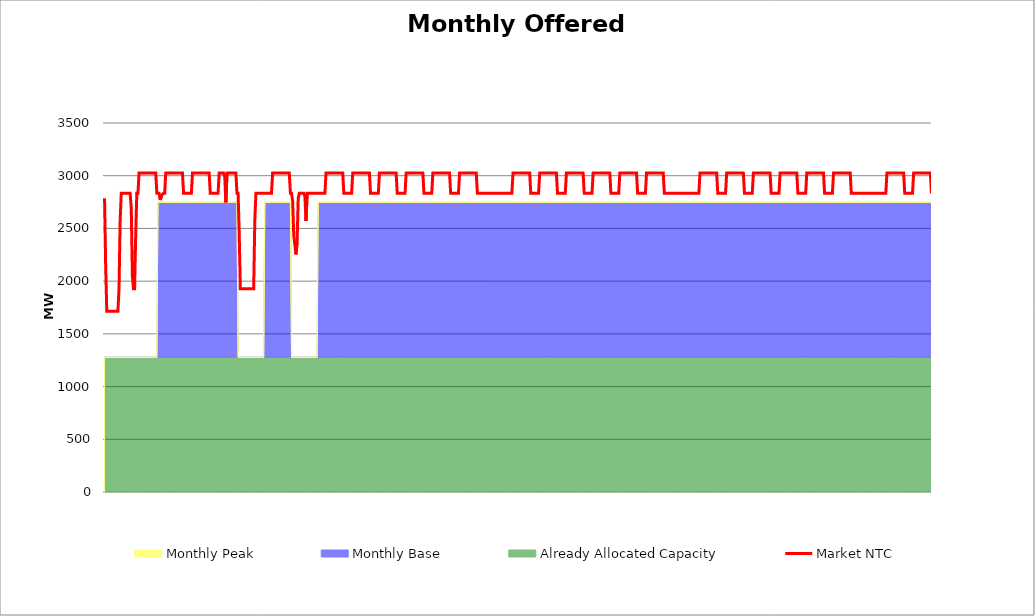
| Category | Market NTC |
|---|---|
| 0 | 2786 |
| 1 | 2143 |
| 2 | 1715 |
| 3 | 1715 |
| 4 | 1715 |
| 5 | 1715 |
| 6 | 1715 |
| 7 | 1715 |
| 8 | 1715 |
| 9 | 1715 |
| 10 | 1715 |
| 11 | 1715 |
| 12 | 1715 |
| 13 | 1929 |
| 14 | 2572 |
| 15 | 2833 |
| 16 | 2833 |
| 17 | 2833 |
| 18 | 2833 |
| 19 | 2833 |
| 20 | 2833 |
| 21 | 2833 |
| 22 | 2833 |
| 23 | 2833 |
| 24 | 2690 |
| 25 | 2047 |
| 26 | 1929 |
| 27 | 1929 |
| 28 | 2452 |
| 29 | 2833 |
| 30 | 2833 |
| 31 | 3025 |
| 32 | 3025 |
| 33 | 3025 |
| 34 | 3025 |
| 35 | 3025 |
| 36 | 3025 |
| 37 | 3025 |
| 38 | 3025 |
| 39 | 3025 |
| 40 | 3025 |
| 41 | 3025 |
| 42 | 3025 |
| 43 | 3025 |
| 44 | 3025 |
| 45 | 3025 |
| 46 | 3025 |
| 47 | 2833 |
| 48 | 2833 |
| 49 | 2833 |
| 50 | 2770 |
| 51 | 2801 |
| 52 | 2825 |
| 53 | 2833 |
| 54 | 2833 |
| 55 | 3025 |
| 56 | 3025 |
| 57 | 3025 |
| 58 | 3025 |
| 59 | 3025 |
| 60 | 3025 |
| 61 | 3025 |
| 62 | 3025 |
| 63 | 3025 |
| 64 | 3025 |
| 65 | 3025 |
| 66 | 3025 |
| 67 | 3025 |
| 68 | 3025 |
| 69 | 3025 |
| 70 | 3025 |
| 71 | 2833 |
| 72 | 2833 |
| 73 | 2833 |
| 74 | 2833 |
| 75 | 2833 |
| 76 | 2833 |
| 77 | 2833 |
| 78 | 2833 |
| 79 | 3025 |
| 80 | 3025 |
| 81 | 3025 |
| 82 | 3025 |
| 83 | 3025 |
| 84 | 3025 |
| 85 | 3025 |
| 86 | 3025 |
| 87 | 3025 |
| 88 | 3025 |
| 89 | 3025 |
| 90 | 3025 |
| 91 | 3025 |
| 92 | 3025 |
| 93 | 3025 |
| 94 | 3025 |
| 95 | 2833 |
| 96 | 2833 |
| 97 | 2833 |
| 98 | 2833 |
| 99 | 2833 |
| 100 | 2833 |
| 101 | 2833 |
| 102 | 2833 |
| 103 | 3025 |
| 104 | 3025 |
| 105 | 3025 |
| 106 | 3025 |
| 107 | 3025 |
| 108 | 2990 |
| 109 | 2747 |
| 110 | 3025 |
| 111 | 3025 |
| 112 | 3025 |
| 113 | 3025 |
| 114 | 3025 |
| 115 | 3025 |
| 116 | 3025 |
| 117 | 3025 |
| 118 | 3025 |
| 119 | 2833 |
| 120 | 2833 |
| 121 | 2452 |
| 122 | 1929 |
| 123 | 1929 |
| 124 | 1929 |
| 125 | 1929 |
| 126 | 1929 |
| 127 | 1929 |
| 128 | 1929 |
| 129 | 1929 |
| 130 | 1929 |
| 131 | 1929 |
| 132 | 1929 |
| 133 | 1929 |
| 134 | 1929 |
| 135 | 2572 |
| 136 | 2833 |
| 137 | 2833 |
| 138 | 2833 |
| 139 | 2833 |
| 140 | 2833 |
| 141 | 2833 |
| 142 | 2833 |
| 143 | 2833 |
| 144 | 2833 |
| 145 | 2833 |
| 146 | 2833 |
| 147 | 2833 |
| 148 | 2833 |
| 149 | 2833 |
| 150 | 2833 |
| 151 | 3025 |
| 152 | 3025 |
| 153 | 3025 |
| 154 | 3025 |
| 155 | 3025 |
| 156 | 3025 |
| 157 | 3025 |
| 158 | 3025 |
| 159 | 3025 |
| 160 | 3025 |
| 161 | 3025 |
| 162 | 3025 |
| 163 | 3025 |
| 164 | 3025 |
| 165 | 3025 |
| 166 | 3025 |
| 167 | 2833 |
| 168 | 2833 |
| 169 | 2760 |
| 170 | 2436 |
| 171 | 2343 |
| 172 | 2254 |
| 173 | 2367 |
| 174 | 2785 |
| 175 | 2833 |
| 176 | 2833 |
| 177 | 2833 |
| 178 | 2833 |
| 179 | 2833 |
| 180 | 2808 |
| 181 | 2570 |
| 182 | 2833 |
| 183 | 2833 |
| 184 | 2833 |
| 185 | 2833 |
| 186 | 2833 |
| 187 | 2833 |
| 188 | 2833 |
| 189 | 2833 |
| 190 | 2833 |
| 191 | 2833 |
| 192 | 2833 |
| 193 | 2833 |
| 194 | 2833 |
| 195 | 2833 |
| 196 | 2833 |
| 197 | 2833 |
| 198 | 2833 |
| 199 | 3025 |
| 200 | 3025 |
| 201 | 3025 |
| 202 | 3025 |
| 203 | 3025 |
| 204 | 3025 |
| 205 | 3025 |
| 206 | 3025 |
| 207 | 3025 |
| 208 | 3025 |
| 209 | 3025 |
| 210 | 3025 |
| 211 | 3025 |
| 212 | 3025 |
| 213 | 3025 |
| 214 | 3025 |
| 215 | 2833 |
| 216 | 2833 |
| 217 | 2833 |
| 218 | 2833 |
| 219 | 2833 |
| 220 | 2833 |
| 221 | 2833 |
| 222 | 2833 |
| 223 | 3025 |
| 224 | 3025 |
| 225 | 3025 |
| 226 | 3025 |
| 227 | 3025 |
| 228 | 3025 |
| 229 | 3025 |
| 230 | 3025 |
| 231 | 3025 |
| 232 | 3025 |
| 233 | 3025 |
| 234 | 3025 |
| 235 | 3025 |
| 236 | 3025 |
| 237 | 3025 |
| 238 | 3025 |
| 239 | 2833 |
| 240 | 2833 |
| 241 | 2833 |
| 242 | 2833 |
| 243 | 2833 |
| 244 | 2833 |
| 245 | 2833 |
| 246 | 2833 |
| 247 | 3025 |
| 248 | 3025 |
| 249 | 3025 |
| 250 | 3025 |
| 251 | 3025 |
| 252 | 3025 |
| 253 | 3025 |
| 254 | 3025 |
| 255 | 3025 |
| 256 | 3025 |
| 257 | 3025 |
| 258 | 3025 |
| 259 | 3025 |
| 260 | 3025 |
| 261 | 3025 |
| 262 | 3025 |
| 263 | 2833 |
| 264 | 2833 |
| 265 | 2833 |
| 266 | 2833 |
| 267 | 2833 |
| 268 | 2833 |
| 269 | 2833 |
| 270 | 2833 |
| 271 | 3025 |
| 272 | 3025 |
| 273 | 3025 |
| 274 | 3025 |
| 275 | 3025 |
| 276 | 3025 |
| 277 | 3025 |
| 278 | 3025 |
| 279 | 3025 |
| 280 | 3025 |
| 281 | 3025 |
| 282 | 3025 |
| 283 | 3025 |
| 284 | 3025 |
| 285 | 3025 |
| 286 | 3025 |
| 287 | 2833 |
| 288 | 2833 |
| 289 | 2833 |
| 290 | 2833 |
| 291 | 2833 |
| 292 | 2833 |
| 293 | 2833 |
| 294 | 2833 |
| 295 | 3025 |
| 296 | 3025 |
| 297 | 3025 |
| 298 | 3025 |
| 299 | 3025 |
| 300 | 3025 |
| 301 | 3025 |
| 302 | 3025 |
| 303 | 3025 |
| 304 | 3025 |
| 305 | 3025 |
| 306 | 3025 |
| 307 | 3025 |
| 308 | 3025 |
| 309 | 3025 |
| 310 | 3025 |
| 311 | 2833 |
| 312 | 2833 |
| 313 | 2833 |
| 314 | 2833 |
| 315 | 2833 |
| 316 | 2833 |
| 317 | 2833 |
| 318 | 2833 |
| 319 | 3025 |
| 320 | 3025 |
| 321 | 3025 |
| 322 | 3025 |
| 323 | 3025 |
| 324 | 3025 |
| 325 | 3025 |
| 326 | 3025 |
| 327 | 3025 |
| 328 | 3025 |
| 329 | 3025 |
| 330 | 3025 |
| 331 | 3025 |
| 332 | 3025 |
| 333 | 3025 |
| 334 | 3025 |
| 335 | 2833 |
| 336 | 2833 |
| 337 | 2833 |
| 338 | 2833 |
| 339 | 2833 |
| 340 | 2833 |
| 341 | 2833 |
| 342 | 2833 |
| 343 | 2833 |
| 344 | 2833 |
| 345 | 2833 |
| 346 | 2833 |
| 347 | 2833 |
| 348 | 2833 |
| 349 | 2833 |
| 350 | 2833 |
| 351 | 2833 |
| 352 | 2833 |
| 353 | 2833 |
| 354 | 2833 |
| 355 | 2833 |
| 356 | 2833 |
| 357 | 2833 |
| 358 | 2833 |
| 359 | 2833 |
| 360 | 2833 |
| 361 | 2833 |
| 362 | 2833 |
| 363 | 2833 |
| 364 | 2833 |
| 365 | 2833 |
| 366 | 2833 |
| 367 | 3025 |
| 368 | 3025 |
| 369 | 3025 |
| 370 | 3025 |
| 371 | 3025 |
| 372 | 3025 |
| 373 | 3025 |
| 374 | 3025 |
| 375 | 3025 |
| 376 | 3025 |
| 377 | 3025 |
| 378 | 3025 |
| 379 | 3025 |
| 380 | 3025 |
| 381 | 3025 |
| 382 | 3025 |
| 383 | 2833 |
| 384 | 2833 |
| 385 | 2833 |
| 386 | 2833 |
| 387 | 2833 |
| 388 | 2833 |
| 389 | 2833 |
| 390 | 2833 |
| 391 | 3025 |
| 392 | 3025 |
| 393 | 3025 |
| 394 | 3025 |
| 395 | 3025 |
| 396 | 3025 |
| 397 | 3025 |
| 398 | 3025 |
| 399 | 3025 |
| 400 | 3025 |
| 401 | 3025 |
| 402 | 3025 |
| 403 | 3025 |
| 404 | 3025 |
| 405 | 3025 |
| 406 | 3025 |
| 407 | 2833 |
| 408 | 2833 |
| 409 | 2833 |
| 410 | 2833 |
| 411 | 2833 |
| 412 | 2833 |
| 413 | 2833 |
| 414 | 2833 |
| 415 | 3025 |
| 416 | 3025 |
| 417 | 3025 |
| 418 | 3025 |
| 419 | 3025 |
| 420 | 3025 |
| 421 | 3025 |
| 422 | 3025 |
| 423 | 3025 |
| 424 | 3025 |
| 425 | 3025 |
| 426 | 3025 |
| 427 | 3025 |
| 428 | 3025 |
| 429 | 3025 |
| 430 | 3025 |
| 431 | 2833 |
| 432 | 2833 |
| 433 | 2833 |
| 434 | 2833 |
| 435 | 2833 |
| 436 | 2833 |
| 437 | 2833 |
| 438 | 2833 |
| 439 | 3025 |
| 440 | 3025 |
| 441 | 3025 |
| 442 | 3025 |
| 443 | 3025 |
| 444 | 3025 |
| 445 | 3025 |
| 446 | 3025 |
| 447 | 3025 |
| 448 | 3025 |
| 449 | 3025 |
| 450 | 3025 |
| 451 | 3025 |
| 452 | 3025 |
| 453 | 3025 |
| 454 | 3025 |
| 455 | 2833 |
| 456 | 2833 |
| 457 | 2833 |
| 458 | 2833 |
| 459 | 2833 |
| 460 | 2833 |
| 461 | 2833 |
| 462 | 2833 |
| 463 | 3025 |
| 464 | 3025 |
| 465 | 3025 |
| 466 | 3025 |
| 467 | 3025 |
| 468 | 3025 |
| 469 | 3025 |
| 470 | 3025 |
| 471 | 3025 |
| 472 | 3025 |
| 473 | 3025 |
| 474 | 3025 |
| 475 | 3025 |
| 476 | 3025 |
| 477 | 3025 |
| 478 | 3025 |
| 479 | 2833 |
| 480 | 2833 |
| 481 | 2833 |
| 482 | 2833 |
| 483 | 2833 |
| 484 | 2833 |
| 485 | 2833 |
| 486 | 2833 |
| 487 | 3025 |
| 488 | 3025 |
| 489 | 3025 |
| 490 | 3025 |
| 491 | 3025 |
| 492 | 3025 |
| 493 | 3025 |
| 494 | 3025 |
| 495 | 3025 |
| 496 | 3025 |
| 497 | 3025 |
| 498 | 3025 |
| 499 | 3025 |
| 500 | 3025 |
| 501 | 3025 |
| 502 | 3025 |
| 503 | 2833 |
| 504 | 2833 |
| 505 | 2833 |
| 506 | 2833 |
| 507 | 2833 |
| 508 | 2833 |
| 509 | 2833 |
| 510 | 2833 |
| 511 | 2833 |
| 512 | 2833 |
| 513 | 2833 |
| 514 | 2833 |
| 515 | 2833 |
| 516 | 2833 |
| 517 | 2833 |
| 518 | 2833 |
| 519 | 2833 |
| 520 | 2833 |
| 521 | 2833 |
| 522 | 2833 |
| 523 | 2833 |
| 524 | 2833 |
| 525 | 2833 |
| 526 | 2833 |
| 527 | 2833 |
| 528 | 2833 |
| 529 | 2833 |
| 530 | 2833 |
| 531 | 2833 |
| 532 | 2833 |
| 533 | 2833 |
| 534 | 2833 |
| 535 | 3025 |
| 536 | 3025 |
| 537 | 3025 |
| 538 | 3025 |
| 539 | 3025 |
| 540 | 3025 |
| 541 | 3025 |
| 542 | 3025 |
| 543 | 3025 |
| 544 | 3025 |
| 545 | 3025 |
| 546 | 3025 |
| 547 | 3025 |
| 548 | 3025 |
| 549 | 3025 |
| 550 | 3025 |
| 551 | 2833 |
| 552 | 2833 |
| 553 | 2833 |
| 554 | 2833 |
| 555 | 2833 |
| 556 | 2833 |
| 557 | 2833 |
| 558 | 2833 |
| 559 | 3025 |
| 560 | 3025 |
| 561 | 3025 |
| 562 | 3025 |
| 563 | 3025 |
| 564 | 3025 |
| 565 | 3025 |
| 566 | 3025 |
| 567 | 3025 |
| 568 | 3025 |
| 569 | 3025 |
| 570 | 3025 |
| 571 | 3025 |
| 572 | 3025 |
| 573 | 3025 |
| 574 | 3025 |
| 575 | 2833 |
| 576 | 2833 |
| 577 | 2833 |
| 578 | 2833 |
| 579 | 2833 |
| 580 | 2833 |
| 581 | 2833 |
| 582 | 2833 |
| 583 | 3025 |
| 584 | 3025 |
| 585 | 3025 |
| 586 | 3025 |
| 587 | 3025 |
| 588 | 3025 |
| 589 | 3025 |
| 590 | 3025 |
| 591 | 3025 |
| 592 | 3025 |
| 593 | 3025 |
| 594 | 3025 |
| 595 | 3025 |
| 596 | 3025 |
| 597 | 3025 |
| 598 | 3025 |
| 599 | 2833 |
| 600 | 2833 |
| 601 | 2833 |
| 602 | 2833 |
| 603 | 2833 |
| 604 | 2833 |
| 605 | 2833 |
| 606 | 2833 |
| 607 | 3025 |
| 608 | 3025 |
| 609 | 3025 |
| 610 | 3025 |
| 611 | 3025 |
| 612 | 3025 |
| 613 | 3025 |
| 614 | 3025 |
| 615 | 3025 |
| 616 | 3025 |
| 617 | 3025 |
| 618 | 3025 |
| 619 | 3025 |
| 620 | 3025 |
| 621 | 3025 |
| 622 | 3025 |
| 623 | 2833 |
| 624 | 2833 |
| 625 | 2833 |
| 626 | 2833 |
| 627 | 2833 |
| 628 | 2833 |
| 629 | 2833 |
| 630 | 2833 |
| 631 | 3025 |
| 632 | 3025 |
| 633 | 3025 |
| 634 | 3025 |
| 635 | 3025 |
| 636 | 3025 |
| 637 | 3025 |
| 638 | 3025 |
| 639 | 3025 |
| 640 | 3025 |
| 641 | 3025 |
| 642 | 3025 |
| 643 | 3025 |
| 644 | 3025 |
| 645 | 3025 |
| 646 | 3025 |
| 647 | 2833 |
| 648 | 2833 |
| 649 | 2833 |
| 650 | 2833 |
| 651 | 2833 |
| 652 | 2833 |
| 653 | 2833 |
| 654 | 2833 |
| 655 | 3025 |
| 656 | 3025 |
| 657 | 3025 |
| 658 | 3025 |
| 659 | 3025 |
| 660 | 3025 |
| 661 | 3025 |
| 662 | 3025 |
| 663 | 3025 |
| 664 | 3025 |
| 665 | 3025 |
| 666 | 3025 |
| 667 | 3025 |
| 668 | 3025 |
| 669 | 3025 |
| 670 | 3025 |
| 671 | 2833 |
| 672 | 2833 |
| 673 | 2833 |
| 674 | 2833 |
| 675 | 2833 |
| 676 | 2833 |
| 677 | 2833 |
| 678 | 2833 |
| 679 | 2833 |
| 680 | 2833 |
| 681 | 2833 |
| 682 | 2833 |
| 683 | 2833 |
| 684 | 2833 |
| 685 | 2833 |
| 686 | 2833 |
| 687 | 2833 |
| 688 | 2833 |
| 689 | 2833 |
| 690 | 2833 |
| 691 | 2833 |
| 692 | 2833 |
| 693 | 2833 |
| 694 | 2833 |
| 695 | 2833 |
| 696 | 2833 |
| 697 | 2833 |
| 698 | 2833 |
| 699 | 2833 |
| 700 | 2833 |
| 701 | 2833 |
| 702 | 2833 |
| 703 | 3025 |
| 704 | 3025 |
| 705 | 3025 |
| 706 | 3025 |
| 707 | 3025 |
| 708 | 3025 |
| 709 | 3025 |
| 710 | 3025 |
| 711 | 3025 |
| 712 | 3025 |
| 713 | 3025 |
| 714 | 3025 |
| 715 | 3025 |
| 716 | 3025 |
| 717 | 3025 |
| 718 | 3025 |
| 719 | 2833 |
| 720 | 2833 |
| 721 | 2833 |
| 722 | 2833 |
| 723 | 2833 |
| 724 | 2833 |
| 725 | 2833 |
| 726 | 2833 |
| 727 | 3025 |
| 728 | 3025 |
| 729 | 3025 |
| 730 | 3025 |
| 731 | 3025 |
| 732 | 3025 |
| 733 | 3025 |
| 734 | 3025 |
| 735 | 3025 |
| 736 | 3025 |
| 737 | 3025 |
| 738 | 3025 |
| 739 | 3025 |
| 740 | 3025 |
| 741 | 3025 |
| 742 | 3025 |
| 743 | 2833 |